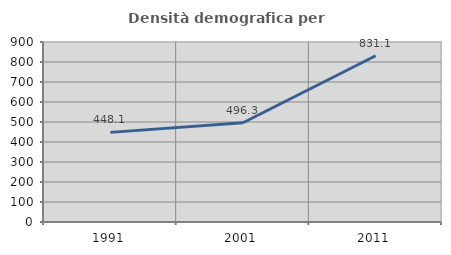
| Category | Densità demografica |
|---|---|
| 1991.0 | 448.111 |
| 2001.0 | 496.319 |
| 2011.0 | 831.142 |